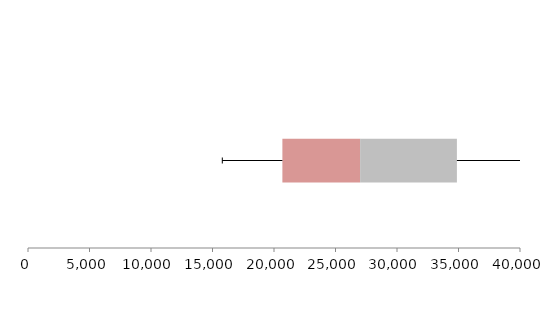
| Category | Series 1 | Series 2 | Series 3 |
|---|---|---|---|
| 0 | 20681.866 | 6320.146 | 7868.192 |